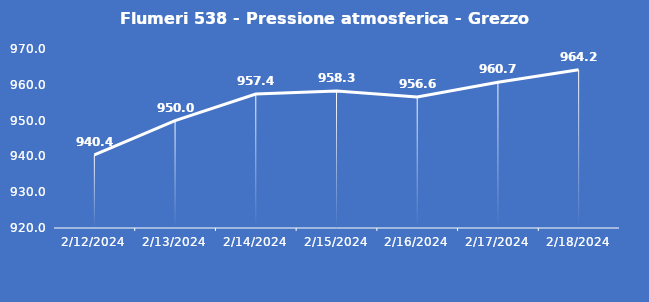
| Category | Flumeri 538 - Pressione atmosferica - Grezzo (hPa) |
|---|---|
| 2/12/24 | 940.4 |
| 2/13/24 | 950 |
| 2/14/24 | 957.4 |
| 2/15/24 | 958.3 |
| 2/16/24 | 956.6 |
| 2/17/24 | 960.7 |
| 2/18/24 | 964.2 |